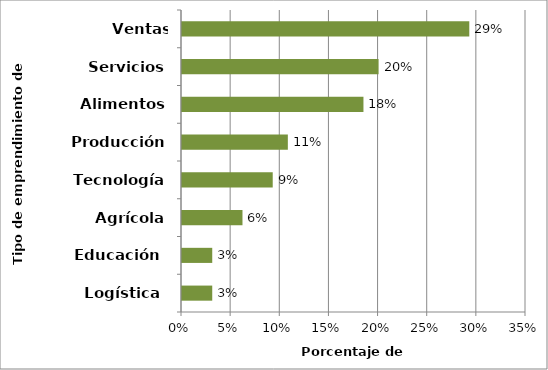
| Category | Series 0 |
|---|---|
| Logística  | 0.031 |
| Educación  | 0.031 |
| Agrícola | 0.062 |
| Tecnología | 0.092 |
| Producción | 0.108 |
| Alimentos | 0.185 |
| Servicios | 0.2 |
| Ventas productos | 0.292 |